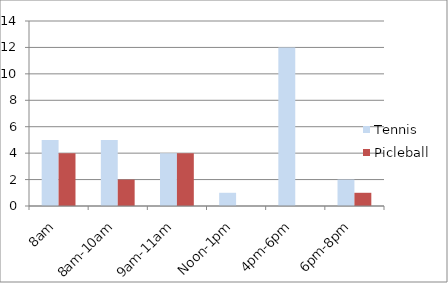
| Category | Tennis | Picleball |
|---|---|---|
| 8am | 5 | 4 |
| 8am-10am | 5 | 2 |
| 9am-11am | 4 | 4 |
| Noon-1pm | 1 | 0 |
| 4pm-6pm | 12 | 0 |
| 6pm-8pm | 2 | 1 |